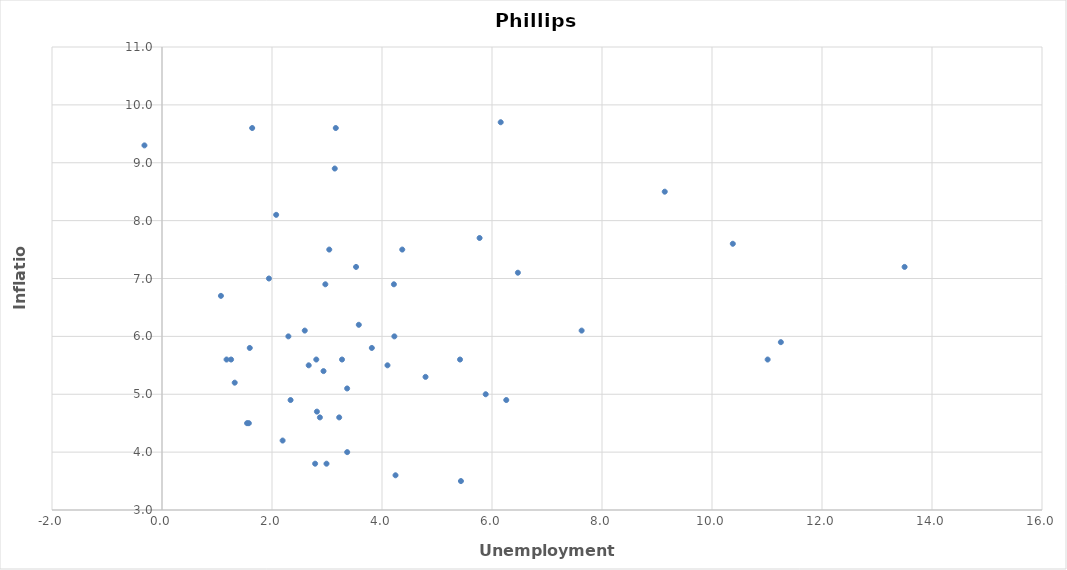
| Category | UN |
|---|---|
| 1.07149 | 6.7 |
| 1.17383 | 5.6 |
| 1.25607 | 5.6 |
| 1.3221 | 5.2 |
| 1.57871 | 4.5 |
| 2.99099 | 3.8 |
| 2.78402 | 3.8 |
| 4.24569 | 3.6 |
| 5.43516 | 3.5 |
| 5.88556 | 5 |
| 4.22481 | 6 |
| 3.27298 | 5.6 |
| 6.25957 | 4.9 |
| 11.01182 | 5.6 |
| 9.14086 | 8.5 |
| 5.77427 | 7.7 |
| 6.47076 | 7.1 |
| 7.62987 | 6.1 |
| 11.25195 | 5.9 |
| 13.50178 | 7.2 |
| 10.37835 | 7.6 |
| 6.15838 | 9.7 |
| 3.15954 | 9.6 |
| 4.36822 | 7.5 |
| 3.52823 | 7.2 |
| 1.94424 | 7 |
| 3.5782 | 6.2 |
| 4.09974 | 5.5 |
| 4.79138 | 5.3 |
| 5.41866 | 5.6 |
| 4.21635 | 6.9 |
| 3.04112 | 7.5 |
| 2.96989 | 6.9 |
| 2.5956 | 6.1 |
| 2.80519 | 5.6 |
| 2.93668 | 5.4 |
| 2.33778 | 4.9 |
| 1.5468 | 4.5 |
| 2.19314 | 4.2 |
| 3.36709 | 4 |
| 2.81662 | 4.7 |
| 1.59567 | 5.8 |
| 2.29781 | 6 |
| 2.66739 | 5.5 |
| 3.36619 | 5.1 |
| 3.22174 | 4.6 |
| 2.87064 | 4.6 |
| 3.81492 | 5.8 |
| -0.31916 | 9.3 |
| 1.63958 | 9.6 |
| 3.14098 | 8.9 |
| 2.07571 | 8.1 |